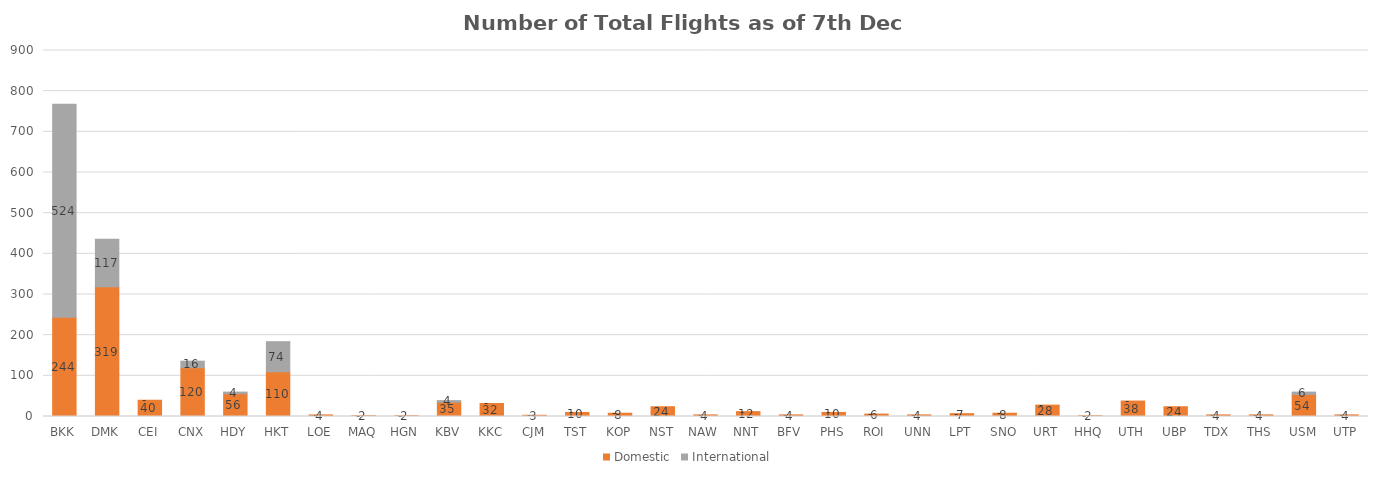
| Category | Domestic | International |
|---|---|---|
| BKK | 244 | 524 |
| DMK | 319 | 117 |
| CEI | 40 | 0 |
| CNX | 120 | 16 |
| HDY | 56 | 4 |
| HKT | 110 | 74 |
| LOE | 4 | 0 |
| MAQ | 2 | 0 |
| HGN | 2 | 0 |
| KBV | 35 | 4 |
| KKC | 32 | 0 |
| CJM | 3 | 0 |
| TST | 10 | 0 |
| KOP | 8 | 0 |
| NST | 24 | 0 |
| NAW | 4 | 0 |
| NNT | 12 | 0 |
| BFV | 4 | 0 |
| PHS | 10 | 0 |
| ROI | 6 | 0 |
| UNN | 4 | 0 |
| LPT | 7 | 0 |
| SNO | 8 | 0 |
| URT | 28 | 0 |
| HHQ | 2 | 0 |
| UTH | 38 | 0 |
| UBP | 24 | 0 |
| TDX | 4 | 0 |
| THS | 4 | 0 |
| USM | 54 | 6 |
| UTP | 4 | 0 |